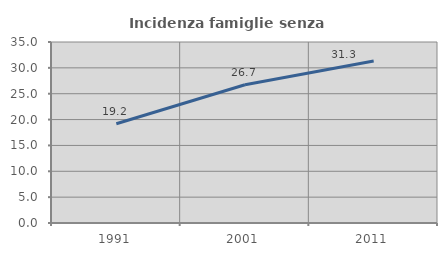
| Category | Incidenza famiglie senza nuclei |
|---|---|
| 1991.0 | 19.199 |
| 2001.0 | 26.744 |
| 2011.0 | 31.316 |